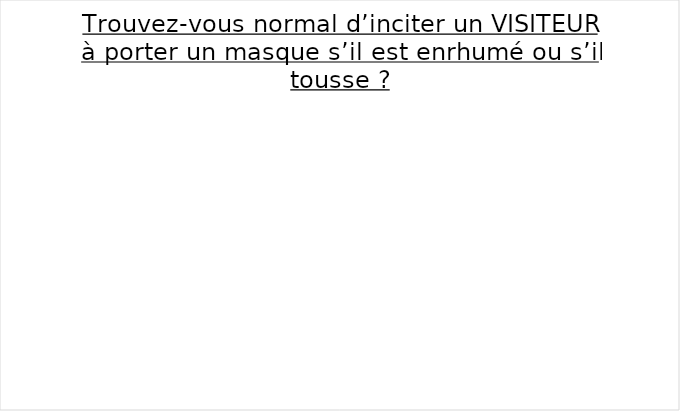
| Category | Series 0 |
|---|---|
| Oui | 0 |
| Non | 0 |
| Sans avis | 0 |